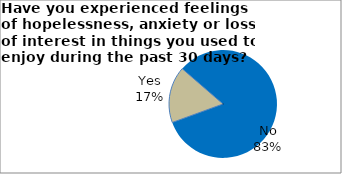
| Category | Series 0 |
|---|---|
| Yes | 16.912 |
| No | 83.088 |